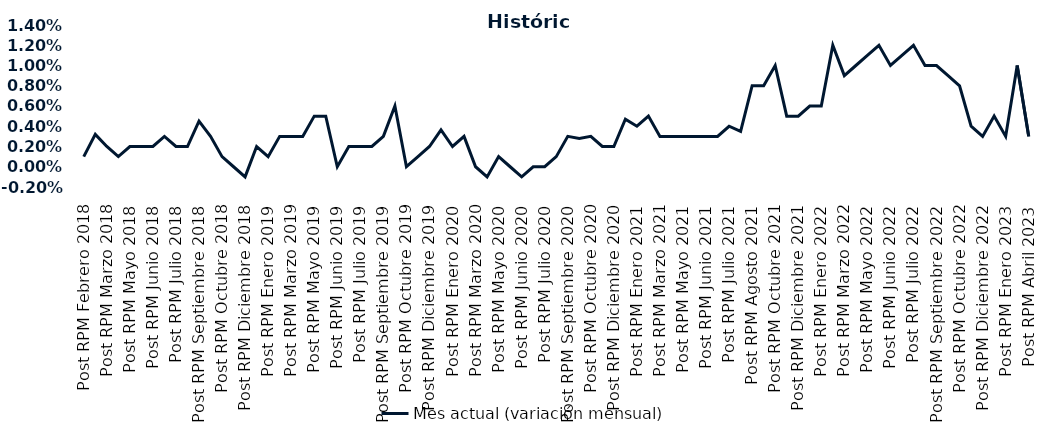
| Category | Mes actual (variación mensual)  |
|---|---|
| Post RPM Febrero 2018 | 0.001 |
| Pre RPM Marzo 2018 | 0.003 |
| Post RPM Marzo 2018 | 0.002 |
| Pre RPM Mayo 2018 | 0.001 |
| Post RPM Mayo 2018 | 0.002 |
| Pre RPM Junio 2018 | 0.002 |
| Post RPM Junio 2018 | 0.002 |
| Pre RPM Julio 2018 | 0.003 |
| Post RPM Julio 2018 | 0.002 |
| Pre RPM Septiembre 2018 | 0.002 |
| Post RPM Septiembre 2018 | 0.004 |
| Pre RPM Octubre 2018 | 0.003 |
| Post RPM Octubre 2018 | 0.001 |
| Pre RPM Diciembre 2018 | 0 |
| Post RPM Diciembre 2018 | -0.001 |
| Pre RPM Enero 2019 | 0.002 |
| Post RPM Enero 2019 | 0.001 |
| Pre RPM Marzo 2019 | 0.003 |
| Post RPM Marzo 2019 | 0.003 |
| Pre RPM Mayo 2019 | 0.003 |
| Post RPM Mayo 2019 | 0.005 |
| Pre RPM Junio 2019 | 0.005 |
| Post RPM Junio 2019 | 0 |
| Pre RPM Julio 2019 | 0.002 |
| Post RPM Julio 2019 | 0.002 |
| Pre RPM Septiembre 2019 | 0.002 |
| Post RPM Septiembre 2019 | 0.003 |
| Pre RPM Octubre 2019 | 0.006 |
| Post RPM Octubre 2019 | 0 |
| Pre RPM Diciembre 2019 | 0.001 |
| Post RPM Diciembre 2019 | 0.002 |
| Pre RPM Enero 2020 | 0.004 |
| Post RPM Enero 2020 | 0.002 |
| Pre RPM Marzo 2020 | 0.003 |
| Post RPM Marzo 2020 | 0 |
| Pre RPM Mayo 2020 | -0.001 |
| Post RPM Mayo 2020 | 0.001 |
| Pre RPM Junio 2020 | 0 |
| Post RPM Junio 2020 | -0.001 |
| Pre RPM Julio 2020 | 0 |
| Post RPM Julio 2020 | 0 |
| Pre RPM Septiembre 2020 | 0.001 |
| Post RPM Septiembre 2020 | 0.003 |
| Pre RPM Octubre 2020 | 0.003 |
| Post RPM Octubre 2020 | 0.003 |
| Pre RPM Diciembre 2020 | 0.002 |
| Post RPM Diciembre 2020 | 0.002 |
| Pre RPM Enero 2021 | 0.005 |
| Post RPM Enero 2021 | 0.004 |
| Pre RPM Marzo 2021 | 0.005 |
| Post RPM Marzo 2021 | 0.003 |
| Pre RPM Mayo 2021 | 0.003 |
| Post RPM Mayo 2021 | 0.003 |
| Pre RPM Junio 2021 | 0.003 |
| Post RPM Junio 2021 | 0.003 |
| Pre RPM Julio 2021 | 0.003 |
| Post RPM Julio 2021 | 0.004 |
| Pre RPM Agosto 2021 | 0.004 |
| Post RPM Agosto 2021 | 0.008 |
| Pre RPM Octubre 2021 | 0.008 |
| Post RPM Octubre 2021 | 0.01 |
| Pre RPM Diciembre 2021 | 0.005 |
| Post RPM Diciembre 2021 | 0.005 |
| Pre RPM Enero 2022 | 0.006 |
| Post RPM Enero 2022 | 0.006 |
| Pre RPM Marzo 2022 | 0.012 |
| Post RPM Marzo 2022 | 0.009 |
| Pre RPM Mayo 2022 | 0.01 |
| Post RPM Mayo 2022 | 0.011 |
| Pre RPM Junio 2022 | 0.012 |
| Post RPM Junio 2022 | 0.01 |
| Pre RPM Julio 2022 | 0.011 |
| Post RPM Julio 2022 | 0.012 |
| Pre RPM Septiembre 2022 | 0.01 |
| Post RPM Septiembre 2022 | 0.01 |
| Pre RPM Octubre 2022 | 0.009 |
| Post RPM Octubre 2022 | 0.008 |
| Pre RPM Diciembre 2022 | 0.004 |
| Post RPM Diciembre 2022 | 0.003 |
| Pre RPM Enero 2023 | 0.005 |
| Post RPM Enero 2023 | 0.003 |
| Pre RPM Abril 2023 | 0.01 |
| Post RPM Abril 2023 | 0.003 |